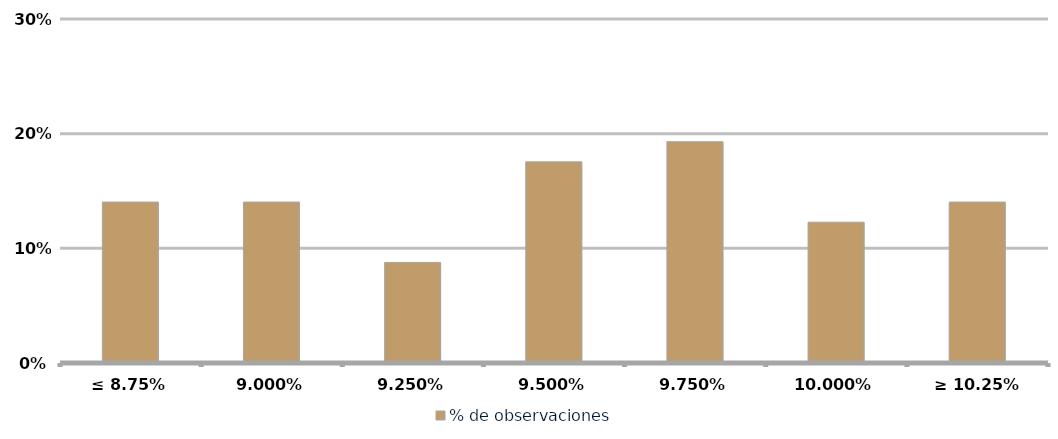
| Category | % de observaciones  |
|---|---|
| ≤ 8.75% | 0.14 |
| 9.00% | 0.14 |
| 9.25% | 0.088 |
| 9.50% | 0.175 |
| 9.75% | 0.193 |
| 10.00% | 0.123 |
| ≥ 10.25% | 0.14 |